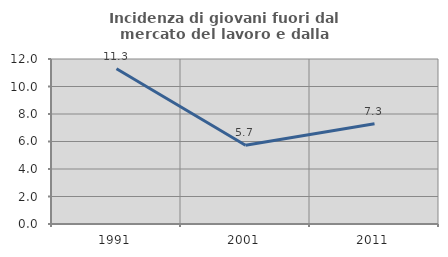
| Category | Incidenza di giovani fuori dal mercato del lavoro e dalla formazione  |
|---|---|
| 1991.0 | 11.286 |
| 2001.0 | 5.732 |
| 2011.0 | 7.287 |